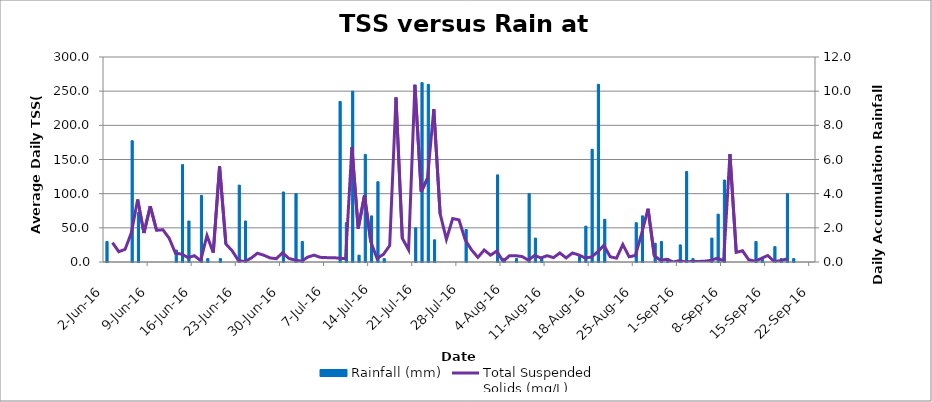
| Category | Rainfall (mm) |
|---|---|
| 2016-06-02 | 1.2 |
| 2016-06-03 | 0 |
| 2016-06-04 | 0 |
| 2016-06-05 | 0 |
| 2016-06-06 | 7.1 |
| 2016-06-07 | 2.9 |
| 2016-06-08 | 0 |
| 2016-06-09 | 0 |
| 2016-06-10 | 0 |
| 2016-06-11 | 0 |
| 2016-06-12 | 0 |
| 2016-06-13 | 0.7 |
| 2016-06-14 | 5.7 |
| 2016-06-15 | 2.4 |
| 2016-06-16 | 0 |
| 2016-06-17 | 3.9 |
| 2016-06-18 | 0.2 |
| 2016-06-19 | 0 |
| 2016-06-20 | 0.2 |
| 2016-06-21 | 0 |
| 2016-06-22 | 0 |
| 2016-06-23 | 4.5 |
| 2016-06-24 | 2.4 |
| 2016-06-25 | 0 |
| 2016-06-26 | 0 |
| 2016-06-27 | 0 |
| 2016-06-28 | 0 |
| 2016-06-29 | 0 |
| 2016-06-30 | 4.1 |
| 2016-07-01 | 0 |
| 2016-07-02 | 4 |
| 2016-07-03 | 1.2 |
| 2016-07-04 | 0 |
| 2016-07-05 | 0 |
| 2016-07-06 | 0 |
| 2016-07-07 | 0 |
| 2016-07-08 | 0 |
| 2016-07-09 | 9.4 |
| 2016-07-10 | 2.3 |
| 2016-07-11 | 10 |
| 2016-07-12 | 0.4 |
| 2016-07-13 | 6.3 |
| 2016-07-14 | 2.7 |
| 2016-07-15 | 4.7 |
| 2016-07-16 | 0.2 |
| 2016-07-17 | 0 |
| 2016-07-18 | 0 |
| 2016-07-19 | 0 |
| 2016-07-20 | 0 |
| 2016-07-21 | 2 |
| 2016-07-22 | 10.5 |
| 2016-07-23 | 10.4 |
| 2016-07-24 | 1.3 |
| 2016-07-25 | 0 |
| 2016-07-26 | 0 |
| 2016-07-27 | 0 |
| 2016-07-28 | 0 |
| 2016-07-29 | 1.9 |
| 2016-07-30 | 0 |
| 2016-07-31 | 0 |
| 2016-08-01 | 0 |
| 2016-08-02 | 0 |
| 2016-08-03 | 5.1 |
| 2016-08-04 | 0.2 |
| 2016-08-05 | 0 |
| 2016-08-06 | 0.2 |
| 2016-08-07 | 0 |
| 2016-08-08 | 4 |
| 2016-08-09 | 1.4 |
| 2016-08-10 | 0.2 |
| 2016-08-11 | 0 |
| 2016-08-12 | 0 |
| 2016-08-13 | 0 |
| 2016-08-14 | 0 |
| 2016-08-15 | 0 |
| 2016-08-16 | 0.4 |
| 2016-08-17 | 2.1 |
| 2016-08-18 | 6.6 |
| 2016-08-19 | 10.4 |
| 2016-08-20 | 2.5 |
| 2016-08-21 | 0 |
| 2016-08-22 | 0 |
| 2016-08-23 | 0 |
| 2016-08-24 | 0 |
| 2016-08-25 | 2.3 |
| 2016-08-26 | 2.7 |
| 2016-08-27 | 0 |
| 2016-08-28 | 1.1 |
| 2016-08-29 | 1.2 |
| 2016-08-30 | 0.2 |
| 2016-08-31 | 0 |
| 2016-09-01 | 1 |
| 2016-09-02 | 5.3 |
| 2016-09-03 | 0.2 |
| 2016-09-04 | 0 |
| 2016-09-05 | 0 |
| 2016-09-06 | 1.4 |
| 2016-09-07 | 2.8 |
| 2016-09-08 | 4.8 |
| 2016-09-09 | 0 |
| 2016-09-10 | 0 |
| 2016-09-11 | 0 |
| 2016-09-12 | 0 |
| 2016-09-13 | 1.2 |
| 2016-09-14 | 0.2 |
| 2016-09-15 | 0 |
| 2016-09-16 | 0.9 |
| 2016-09-17 | 0.2 |
| 2016-09-18 | 4 |
| 2016-09-19 | 0.2 |
| 2016-09-20 | 0 |
| 2016-09-21 | 0 |
| 2016-09-22 | 0 |